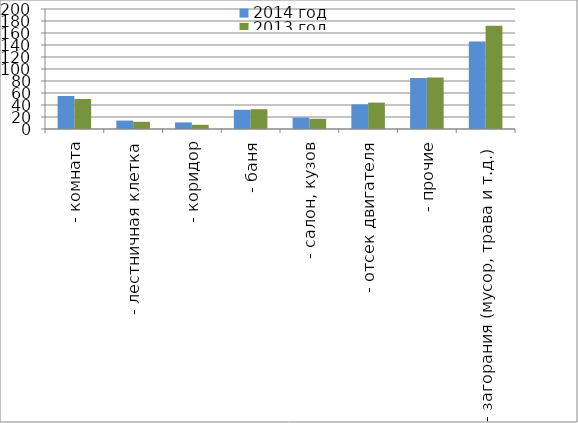
| Category | 2014 год | 2013 год |
|---|---|---|
|  - комната | 55 | 50 |
|  - лестничная клетка | 14 | 12 |
|  - коридор | 11 | 7 |
|  - баня | 32 | 33 |
|  - салон, кузов | 19 | 17 |
|  - отсек двигателя | 41 | 44 |
| - прочие | 85 | 86 |
| - загорания (мусор, трава и т.д.)  | 146 | 172 |